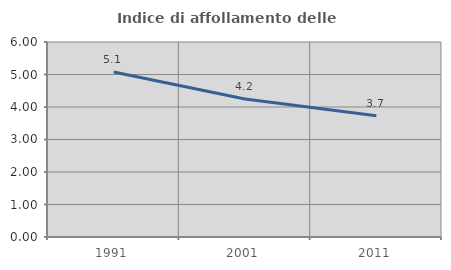
| Category | Indice di affollamento delle abitazioni  |
|---|---|
| 1991.0 | 5.078 |
| 2001.0 | 4.246 |
| 2011.0 | 3.731 |